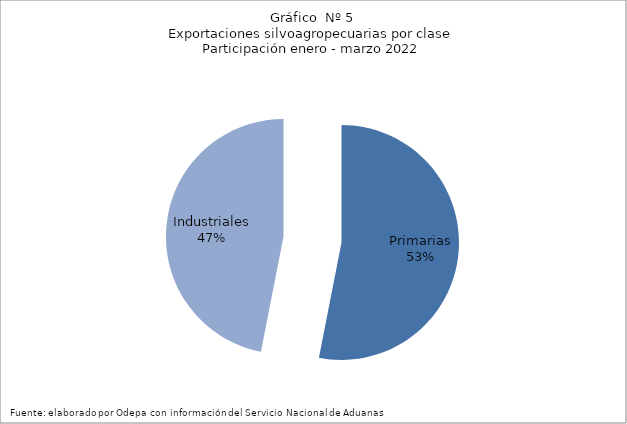
| Category | Series 0 |
|---|---|
| Primarias | 3007993 |
| Industriales | 2658999 |